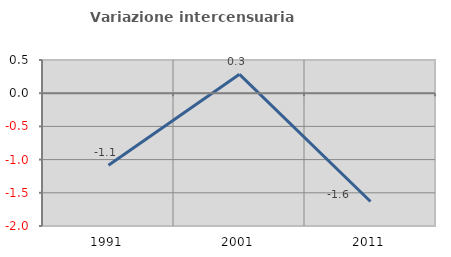
| Category | Variazione intercensuaria annua |
|---|---|
| 1991.0 | -1.085 |
| 2001.0 | 0.285 |
| 2011.0 | -1.632 |